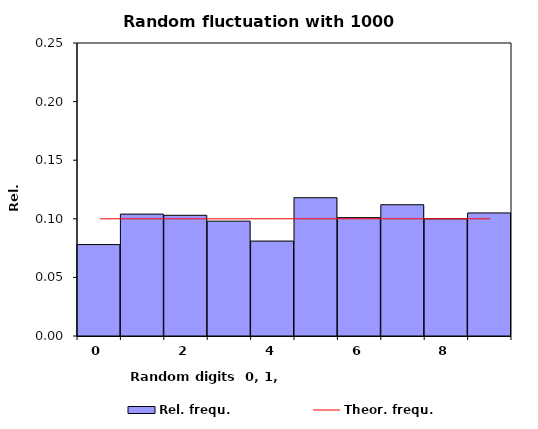
| Category | Rel. frequ. |
|---|---|
| 0.0 | 0.078 |
| 1.0 | 0.104 |
| 2.0 | 0.103 |
| 3.0 | 0.098 |
| 4.0 | 0.081 |
| 5.0 | 0.118 |
| 6.0 | 0.101 |
| 7.0 | 0.112 |
| 8.0 | 0.1 |
| 9.0 | 0.105 |